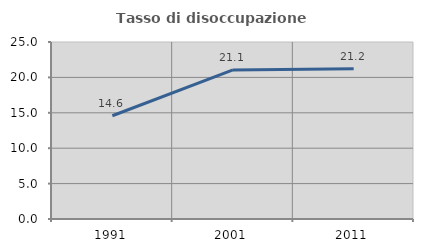
| Category | Tasso di disoccupazione giovanile  |
|---|---|
| 1991.0 | 14.583 |
| 2001.0 | 21.053 |
| 2011.0 | 21.212 |